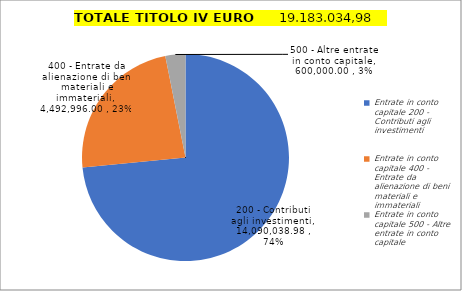
| Category | Series 0 |
|---|---|
| 0 | 14090038.98 |
| 1 | 4492996 |
| 2 | 600000 |